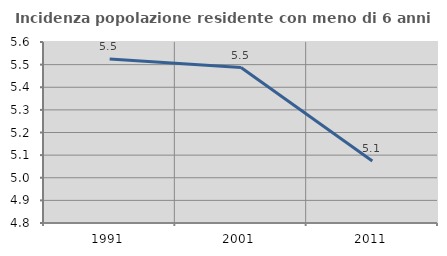
| Category | Incidenza popolazione residente con meno di 6 anni |
|---|---|
| 1991.0 | 5.525 |
| 2001.0 | 5.487 |
| 2011.0 | 5.074 |